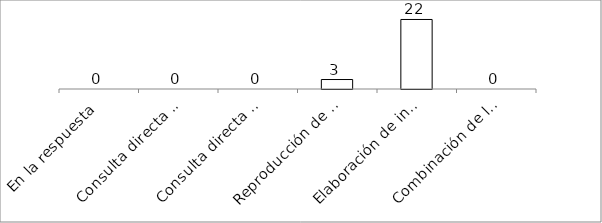
| Category | Series 0 |
|---|---|
| En la respuesta | 0 |
| Consulta directa personal | 0 |
| Consulta directa electrónica | 0 |
| Reproducción de documentos | 3 |
| Elaboración de informes | 22 |
| Combinación de las anteriores | 0 |